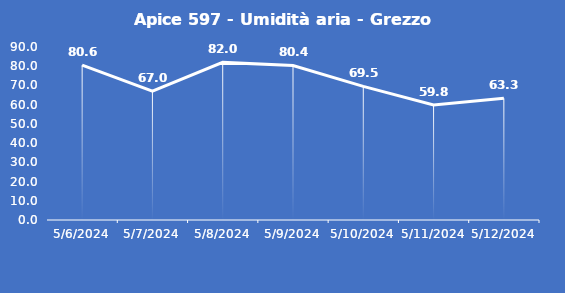
| Category | Apice 597 - Umidità aria - Grezzo (%) |
|---|---|
| 5/6/24 | 80.6 |
| 5/7/24 | 67 |
| 5/8/24 | 82 |
| 5/9/24 | 80.4 |
| 5/10/24 | 69.5 |
| 5/11/24 | 59.8 |
| 5/12/24 | 63.3 |